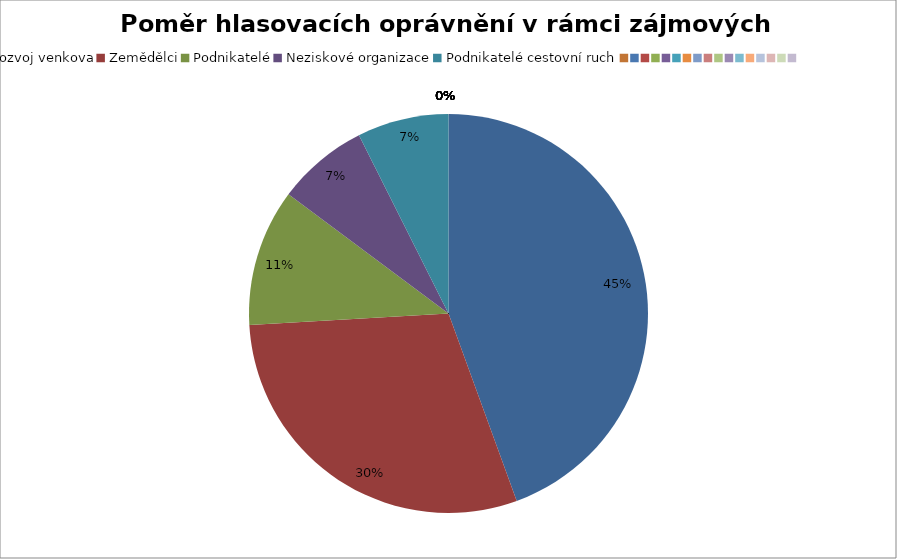
| Category | Series 0 |
|---|---|
| Rozvoj venkova | 0.444 |
| Zemědělci | 0.296 |
| Podnikatelé | 0.111 |
| Neziskové organizace | 0.074 |
| Podnikatelé cestovní ruch | 0.074 |